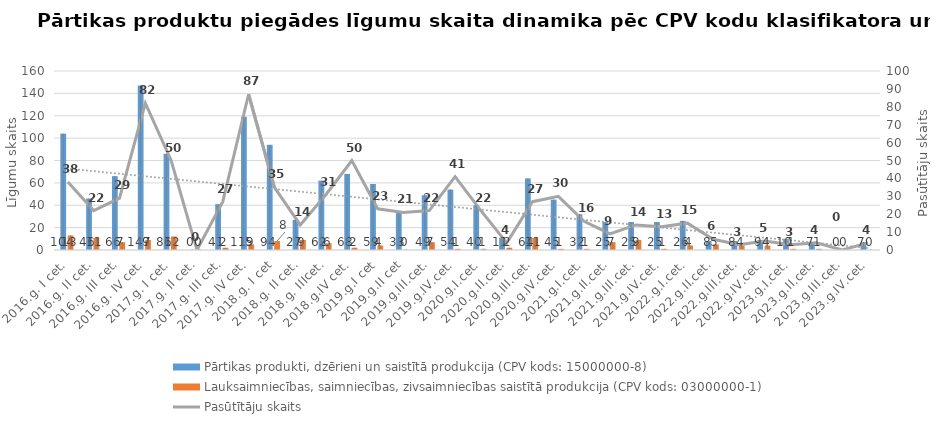
| Category | Pārtikas produkti, dzērieni un saistītā produkcija (CPV kods: 15000000-8) | Lauksaimniecības, saimniecības, zivsaimniecības saistītā produkcija (CPV kods: 03000000-1) |
|---|---|---|
| 2016.g. I cet. | 104 | 13 |
| 2016.g. II cet. | 46 | 11 |
| 2016.g. III cet. | 66 | 7 |
| 2016.g. IV cet. | 147 | 9 |
| 2017.g. I cet. | 86 | 12 |
| 2017.g. II cet. | 0 | 0 |
| 2017.g. III cet. | 41 | 2 |
| 2017.g. IV cet. | 119 | 5 |
| 2018.g. I cet | 94 | 8 |
| 2018.g. II cet. | 27 | 9 |
| 2018.g. IIIcet. | 62 | 6 |
| 2018.g.IV cet. | 68 | 2 |
| 2019.g.I cet | 59 | 4 |
| 2019.g.II cet | 33 | 0 |
| 2019.g.III.cet. | 49 | 7 |
| 2019.g.IV.cet. | 54 | 1 |
| 2020.g.I.cet. | 40 | 1 |
| 2020.g.II.cet. | 11 | 2 |
| 2020.g.III.cet. | 64 | 11 |
| 2020.g.IV.cet. | 45 | 1 |
| 2021.g.I.cet. | 32 | 1 |
| 2021.g.II.cet. | 25 | 7 |
| 2021.g.III.cet. | 25 | 9 |
| 2021.g.IV.cet. | 25 | 1 |
| 2022.g.I.cet. | 26 | 4 |
| 2022.g.II.cet. | 8 | 5 |
| 2022.g.III.cet. | 8 | 4 |
| 2022.g.IV.cet. | 9 | 4 |
| 2023.g.I.cet. | 10 | 1 |
| 2023.g.II.cet. | 7 | 1 |
| 2023.g.III.cet. | 0 | 0 |
| 2023.g.IV.cet. | 7 | 0 |